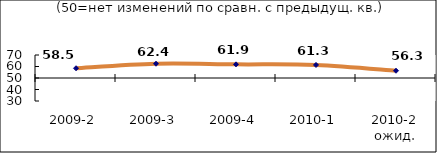
| Category | Диф.индекс ↓ |
|---|---|
| 2009-2 | 58.475 |
| 2009-3 | 62.395 |
| 2009-4 | 61.865 |
| 2010-1 | 61.34 |
| 2010-2 ожид. | 56.31 |